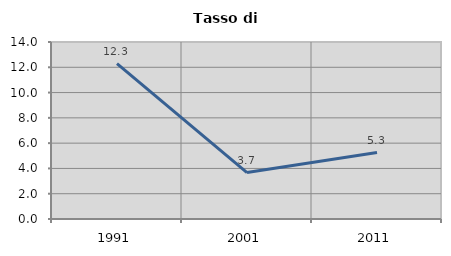
| Category | Tasso di disoccupazione   |
|---|---|
| 1991.0 | 12.284 |
| 2001.0 | 3.67 |
| 2011.0 | 5.258 |